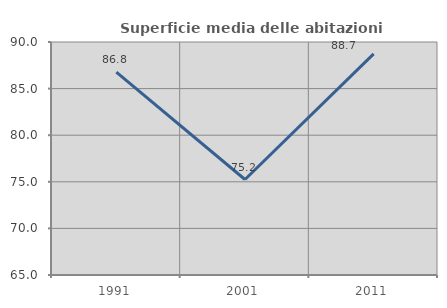
| Category | Superficie media delle abitazioni occupate |
|---|---|
| 1991.0 | 86.759 |
| 2001.0 | 75.245 |
| 2011.0 | 88.72 |